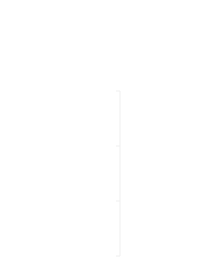
| Category | Positiivne | Negatiivne |
|---|---|---|
| 0 | 0 | 0 |
| 1 | 0 | 0 |
| 2 | 0 | 0 |